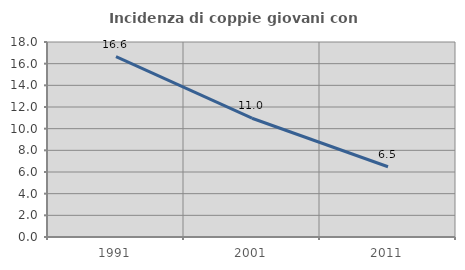
| Category | Incidenza di coppie giovani con figli |
|---|---|
| 1991.0 | 16.643 |
| 2001.0 | 10.963 |
| 2011.0 | 6.483 |